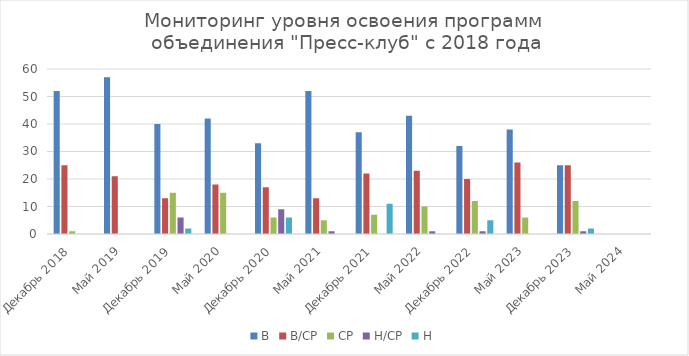
| Category | В | В/СР | СР | Н/СР | Н |
|---|---|---|---|---|---|
| Декабрь 2018 | 52 | 25 | 1 | 0 | 0 |
| Май 2019 | 57 | 21 | 0 | 0 | 0 |
| Декабрь 2019 | 40 | 13 | 15 | 6 | 2 |
| Май 2020 | 42 | 18 | 15 | 0 | 0 |
| Декабрь 2020 | 33 | 17 | 6 | 9 | 6 |
| Май 2021 | 52 | 13 | 5 | 1 | 0 |
| Декабрь 2021 | 37 | 22 | 7 | 0 | 11 |
| Май 2022 | 43 | 23 | 10 | 1 | 0 |
| Декабрь 2022 | 32 | 20 | 12 | 1 | 5 |
| Май 2023 | 38 | 26 | 6 | 0 | 0 |
| Декабрь 2023 | 25 | 25 | 12 | 1 | 2 |
| Май 2024 | 0 | 0 | 0 | 0 | 0 |